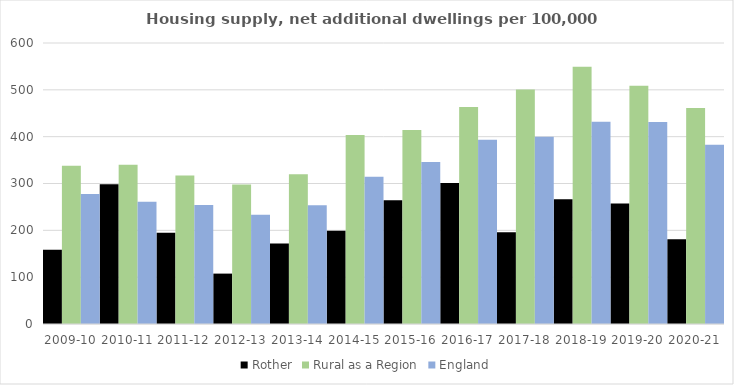
| Category | Rother | Rural as a Region | England |
|---|---|---|---|
| 2009-10 | 158.783 | 337.852 | 277.548 |
| 2010-11 | 298.196 | 340.105 | 260.994 |
| 2011-12 | 195.086 | 317.04 | 254.007 |
| 2012-13 | 107.615 | 297.763 | 233.153 |
| 2013-14 | 172.089 | 319.835 | 253.602 |
| 2014-15 | 199.199 | 403.796 | 314.256 |
| 2015-16 | 263.971 | 414.091 | 346.154 |
| 2016-17 | 301.173 | 463.209 | 393.256 |
| 2017-18 | 195.796 | 500.68 | 399.646 |
| 2018-19 | 266.58 | 549.491 | 432.099 |
| 2019-20 | 257.077 | 508.493 | 431.187 |
| 2020-21 | 180.942 | 461.114 | 382.827 |